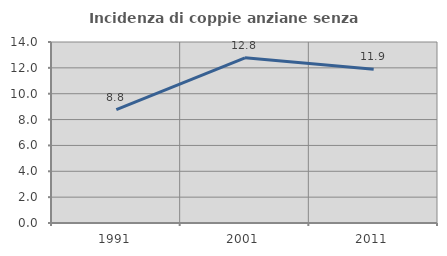
| Category | Incidenza di coppie anziane senza figli  |
|---|---|
| 1991.0 | 8.772 |
| 2001.0 | 12.778 |
| 2011.0 | 11.892 |